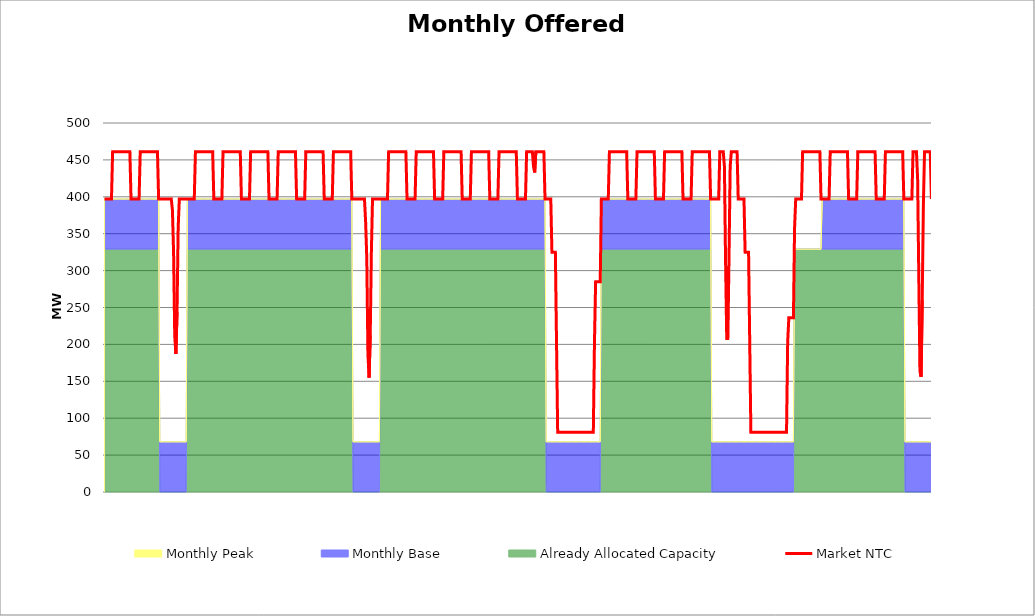
| Category | Market NTC |
|---|---|
| 0 | 397 |
| 1 | 397 |
| 2 | 397 |
| 3 | 397 |
| 4 | 397 |
| 5 | 397 |
| 6 | 397 |
| 7 | 461 |
| 8 | 461 |
| 9 | 461 |
| 10 | 461 |
| 11 | 461 |
| 12 | 461 |
| 13 | 461 |
| 14 | 461 |
| 15 | 461 |
| 16 | 461 |
| 17 | 461 |
| 18 | 461 |
| 19 | 461 |
| 20 | 461 |
| 21 | 461 |
| 22 | 461 |
| 23 | 397 |
| 24 | 397 |
| 25 | 397 |
| 26 | 397 |
| 27 | 397 |
| 28 | 397 |
| 29 | 397 |
| 30 | 397 |
| 31 | 461 |
| 32 | 461 |
| 33 | 461 |
| 34 | 461 |
| 35 | 461 |
| 36 | 461 |
| 37 | 461 |
| 38 | 461 |
| 39 | 461 |
| 40 | 461 |
| 41 | 461 |
| 42 | 461 |
| 43 | 461 |
| 44 | 461 |
| 45 | 461 |
| 46 | 461 |
| 47 | 397 |
| 48 | 397 |
| 49 | 397 |
| 50 | 397 |
| 51 | 397 |
| 52 | 397 |
| 53 | 397 |
| 54 | 397 |
| 55 | 397 |
| 56 | 397 |
| 57 | 397 |
| 58 | 397 |
| 59 | 382 |
| 60 | 325 |
| 61 | 212 |
| 62 | 187 |
| 63 | 244 |
| 64 | 358 |
| 65 | 397 |
| 66 | 397 |
| 67 | 397 |
| 68 | 397 |
| 69 | 397 |
| 70 | 397 |
| 71 | 397 |
| 72 | 397 |
| 73 | 397 |
| 74 | 397 |
| 75 | 397 |
| 76 | 397 |
| 77 | 397 |
| 78 | 397 |
| 79 | 461 |
| 80 | 461 |
| 81 | 461 |
| 82 | 461 |
| 83 | 461 |
| 84 | 461 |
| 85 | 461 |
| 86 | 461 |
| 87 | 461 |
| 88 | 461 |
| 89 | 461 |
| 90 | 461 |
| 91 | 461 |
| 92 | 461 |
| 93 | 461 |
| 94 | 461 |
| 95 | 397 |
| 96 | 397 |
| 97 | 397 |
| 98 | 397 |
| 99 | 397 |
| 100 | 397 |
| 101 | 397 |
| 102 | 397 |
| 103 | 461 |
| 104 | 461 |
| 105 | 461 |
| 106 | 461 |
| 107 | 461 |
| 108 | 461 |
| 109 | 461 |
| 110 | 461 |
| 111 | 461 |
| 112 | 461 |
| 113 | 461 |
| 114 | 461 |
| 115 | 461 |
| 116 | 461 |
| 117 | 461 |
| 118 | 461 |
| 119 | 397 |
| 120 | 397 |
| 121 | 397 |
| 122 | 397 |
| 123 | 397 |
| 124 | 397 |
| 125 | 397 |
| 126 | 397 |
| 127 | 461 |
| 128 | 461 |
| 129 | 461 |
| 130 | 461 |
| 131 | 461 |
| 132 | 461 |
| 133 | 461 |
| 134 | 461 |
| 135 | 461 |
| 136 | 461 |
| 137 | 461 |
| 138 | 461 |
| 139 | 461 |
| 140 | 461 |
| 141 | 461 |
| 142 | 461 |
| 143 | 397 |
| 144 | 397 |
| 145 | 397 |
| 146 | 397 |
| 147 | 397 |
| 148 | 397 |
| 149 | 397 |
| 150 | 397 |
| 151 | 461 |
| 152 | 461 |
| 153 | 461 |
| 154 | 461 |
| 155 | 461 |
| 156 | 461 |
| 157 | 461 |
| 158 | 461 |
| 159 | 461 |
| 160 | 461 |
| 161 | 461 |
| 162 | 461 |
| 163 | 461 |
| 164 | 461 |
| 165 | 461 |
| 166 | 461 |
| 167 | 397 |
| 168 | 397 |
| 169 | 397 |
| 170 | 397 |
| 171 | 397 |
| 172 | 397 |
| 173 | 397 |
| 174 | 397 |
| 175 | 461 |
| 176 | 461 |
| 177 | 461 |
| 178 | 461 |
| 179 | 461 |
| 180 | 461 |
| 181 | 461 |
| 182 | 461 |
| 183 | 461 |
| 184 | 461 |
| 185 | 461 |
| 186 | 461 |
| 187 | 461 |
| 188 | 461 |
| 189 | 461 |
| 190 | 461 |
| 191 | 397 |
| 192 | 397 |
| 193 | 397 |
| 194 | 397 |
| 195 | 397 |
| 196 | 397 |
| 197 | 397 |
| 198 | 397 |
| 199 | 461 |
| 200 | 461 |
| 201 | 461 |
| 202 | 461 |
| 203 | 461 |
| 204 | 461 |
| 205 | 461 |
| 206 | 461 |
| 207 | 461 |
| 208 | 461 |
| 209 | 461 |
| 210 | 461 |
| 211 | 461 |
| 212 | 461 |
| 213 | 461 |
| 214 | 461 |
| 215 | 397 |
| 216 | 397 |
| 217 | 397 |
| 218 | 397 |
| 219 | 397 |
| 220 | 397 |
| 221 | 397 |
| 222 | 397 |
| 223 | 397 |
| 224 | 397 |
| 225 | 397 |
| 226 | 397 |
| 227 | 366 |
| 228 | 317 |
| 229 | 187 |
| 230 | 155 |
| 231 | 212 |
| 232 | 325 |
| 233 | 397 |
| 234 | 397 |
| 235 | 397 |
| 236 | 397 |
| 237 | 397 |
| 238 | 397 |
| 239 | 397 |
| 240 | 397 |
| 241 | 397 |
| 242 | 397 |
| 243 | 397 |
| 244 | 397 |
| 245 | 397 |
| 246 | 397 |
| 247 | 461 |
| 248 | 461 |
| 249 | 461 |
| 250 | 461 |
| 251 | 461 |
| 252 | 461 |
| 253 | 461 |
| 254 | 461 |
| 255 | 461 |
| 256 | 461 |
| 257 | 461 |
| 258 | 461 |
| 259 | 461 |
| 260 | 461 |
| 261 | 461 |
| 262 | 461 |
| 263 | 397 |
| 264 | 397 |
| 265 | 397 |
| 266 | 397 |
| 267 | 397 |
| 268 | 397 |
| 269 | 397 |
| 270 | 397 |
| 271 | 461 |
| 272 | 461 |
| 273 | 461 |
| 274 | 461 |
| 275 | 461 |
| 276 | 461 |
| 277 | 461 |
| 278 | 461 |
| 279 | 461 |
| 280 | 461 |
| 281 | 461 |
| 282 | 461 |
| 283 | 461 |
| 284 | 461 |
| 285 | 461 |
| 286 | 461 |
| 287 | 397 |
| 288 | 397 |
| 289 | 397 |
| 290 | 397 |
| 291 | 397 |
| 292 | 397 |
| 293 | 397 |
| 294 | 397 |
| 295 | 461 |
| 296 | 461 |
| 297 | 461 |
| 298 | 461 |
| 299 | 461 |
| 300 | 461 |
| 301 | 461 |
| 302 | 461 |
| 303 | 461 |
| 304 | 461 |
| 305 | 461 |
| 306 | 461 |
| 307 | 461 |
| 308 | 461 |
| 309 | 461 |
| 310 | 461 |
| 311 | 397 |
| 312 | 397 |
| 313 | 397 |
| 314 | 397 |
| 315 | 397 |
| 316 | 397 |
| 317 | 397 |
| 318 | 397 |
| 319 | 461 |
| 320 | 461 |
| 321 | 461 |
| 322 | 461 |
| 323 | 461 |
| 324 | 461 |
| 325 | 461 |
| 326 | 461 |
| 327 | 461 |
| 328 | 461 |
| 329 | 461 |
| 330 | 461 |
| 331 | 461 |
| 332 | 461 |
| 333 | 461 |
| 334 | 461 |
| 335 | 397 |
| 336 | 397 |
| 337 | 397 |
| 338 | 397 |
| 339 | 397 |
| 340 | 397 |
| 341 | 397 |
| 342 | 397 |
| 343 | 461 |
| 344 | 461 |
| 345 | 461 |
| 346 | 461 |
| 347 | 461 |
| 348 | 461 |
| 349 | 461 |
| 350 | 461 |
| 351 | 461 |
| 352 | 461 |
| 353 | 461 |
| 354 | 461 |
| 355 | 461 |
| 356 | 461 |
| 357 | 461 |
| 358 | 461 |
| 359 | 397 |
| 360 | 397 |
| 361 | 397 |
| 362 | 397 |
| 363 | 397 |
| 364 | 397 |
| 365 | 397 |
| 366 | 397 |
| 367 | 461 |
| 368 | 461 |
| 369 | 461 |
| 370 | 461 |
| 371 | 461 |
| 372 | 461 |
| 373 | 441 |
| 374 | 433 |
| 375 | 461 |
| 376 | 461 |
| 377 | 461 |
| 378 | 461 |
| 379 | 461 |
| 380 | 461 |
| 381 | 461 |
| 382 | 461 |
| 383 | 397 |
| 384 | 397 |
| 385 | 397 |
| 386 | 397 |
| 387 | 397 |
| 388 | 397 |
| 389 | 325 |
| 390 | 325 |
| 391 | 325 |
| 392 | 325 |
| 393 | 203 |
| 394 | 81 |
| 395 | 81 |
| 396 | 81 |
| 397 | 81 |
| 398 | 81 |
| 399 | 81 |
| 400 | 81 |
| 401 | 81 |
| 402 | 81 |
| 403 | 81 |
| 404 | 81 |
| 405 | 81 |
| 406 | 81 |
| 407 | 81 |
| 408 | 81 |
| 409 | 81 |
| 410 | 81 |
| 411 | 81 |
| 412 | 81 |
| 413 | 81 |
| 414 | 81 |
| 415 | 81 |
| 416 | 81 |
| 417 | 81 |
| 418 | 81 |
| 419 | 81 |
| 420 | 81 |
| 421 | 81 |
| 422 | 81 |
| 423 | 81 |
| 424 | 81 |
| 425 | 81 |
| 426 | 203 |
| 427 | 285 |
| 428 | 285 |
| 429 | 285 |
| 430 | 285 |
| 431 | 285 |
| 432 | 397 |
| 433 | 397 |
| 434 | 397 |
| 435 | 397 |
| 436 | 397 |
| 437 | 397 |
| 438 | 397 |
| 439 | 461 |
| 440 | 461 |
| 441 | 461 |
| 442 | 461 |
| 443 | 461 |
| 444 | 461 |
| 445 | 461 |
| 446 | 461 |
| 447 | 461 |
| 448 | 461 |
| 449 | 461 |
| 450 | 461 |
| 451 | 461 |
| 452 | 461 |
| 453 | 461 |
| 454 | 461 |
| 455 | 397 |
| 456 | 397 |
| 457 | 397 |
| 458 | 397 |
| 459 | 397 |
| 460 | 397 |
| 461 | 397 |
| 462 | 397 |
| 463 | 461 |
| 464 | 461 |
| 465 | 461 |
| 466 | 461 |
| 467 | 461 |
| 468 | 461 |
| 469 | 461 |
| 470 | 461 |
| 471 | 461 |
| 472 | 461 |
| 473 | 461 |
| 474 | 461 |
| 475 | 461 |
| 476 | 461 |
| 477 | 461 |
| 478 | 461 |
| 479 | 397 |
| 480 | 397 |
| 481 | 397 |
| 482 | 397 |
| 483 | 397 |
| 484 | 397 |
| 485 | 397 |
| 486 | 397 |
| 487 | 461 |
| 488 | 461 |
| 489 | 461 |
| 490 | 461 |
| 491 | 461 |
| 492 | 461 |
| 493 | 461 |
| 494 | 461 |
| 495 | 461 |
| 496 | 461 |
| 497 | 461 |
| 498 | 461 |
| 499 | 461 |
| 500 | 461 |
| 501 | 461 |
| 502 | 461 |
| 503 | 397 |
| 504 | 397 |
| 505 | 397 |
| 506 | 397 |
| 507 | 397 |
| 508 | 397 |
| 509 | 397 |
| 510 | 397 |
| 511 | 461 |
| 512 | 461 |
| 513 | 461 |
| 514 | 461 |
| 515 | 461 |
| 516 | 461 |
| 517 | 461 |
| 518 | 461 |
| 519 | 461 |
| 520 | 461 |
| 521 | 461 |
| 522 | 461 |
| 523 | 461 |
| 524 | 461 |
| 525 | 461 |
| 526 | 461 |
| 527 | 397 |
| 528 | 397 |
| 529 | 397 |
| 530 | 397 |
| 531 | 397 |
| 532 | 397 |
| 533 | 397 |
| 534 | 397 |
| 535 | 461 |
| 536 | 461 |
| 537 | 461 |
| 538 | 461 |
| 539 | 441 |
| 540 | 312 |
| 541 | 208 |
| 542 | 208 |
| 543 | 320 |
| 544 | 441 |
| 545 | 461 |
| 546 | 461 |
| 547 | 461 |
| 548 | 461 |
| 549 | 461 |
| 550 | 461 |
| 551 | 397 |
| 552 | 397 |
| 553 | 397 |
| 554 | 397 |
| 555 | 397 |
| 556 | 397 |
| 557 | 325 |
| 558 | 325 |
| 559 | 325 |
| 560 | 325 |
| 561 | 203 |
| 562 | 81 |
| 563 | 81 |
| 564 | 81 |
| 565 | 81 |
| 566 | 81 |
| 567 | 81 |
| 568 | 81 |
| 569 | 81 |
| 570 | 81 |
| 571 | 81 |
| 572 | 81 |
| 573 | 81 |
| 574 | 81 |
| 575 | 81 |
| 576 | 81 |
| 577 | 81 |
| 578 | 81 |
| 579 | 81 |
| 580 | 81 |
| 581 | 81 |
| 582 | 81 |
| 583 | 81 |
| 584 | 81 |
| 585 | 81 |
| 586 | 81 |
| 587 | 81 |
| 588 | 81 |
| 589 | 81 |
| 590 | 81 |
| 591 | 81 |
| 592 | 81 |
| 593 | 81 |
| 594 | 203 |
| 595 | 236 |
| 596 | 236 |
| 597 | 236 |
| 598 | 236 |
| 599 | 236 |
| 600 | 358 |
| 601 | 397 |
| 602 | 397 |
| 603 | 397 |
| 604 | 397 |
| 605 | 397 |
| 606 | 397 |
| 607 | 461 |
| 608 | 461 |
| 609 | 461 |
| 610 | 461 |
| 611 | 461 |
| 612 | 461 |
| 613 | 461 |
| 614 | 461 |
| 615 | 461 |
| 616 | 461 |
| 617 | 461 |
| 618 | 461 |
| 619 | 461 |
| 620 | 461 |
| 621 | 461 |
| 622 | 461 |
| 623 | 397 |
| 624 | 397 |
| 625 | 397 |
| 626 | 397 |
| 627 | 397 |
| 628 | 397 |
| 629 | 397 |
| 630 | 397 |
| 631 | 461 |
| 632 | 461 |
| 633 | 461 |
| 634 | 461 |
| 635 | 461 |
| 636 | 461 |
| 637 | 461 |
| 638 | 461 |
| 639 | 461 |
| 640 | 461 |
| 641 | 461 |
| 642 | 461 |
| 643 | 461 |
| 644 | 461 |
| 645 | 461 |
| 646 | 461 |
| 647 | 397 |
| 648 | 397 |
| 649 | 397 |
| 650 | 397 |
| 651 | 397 |
| 652 | 397 |
| 653 | 397 |
| 654 | 397 |
| 655 | 461 |
| 656 | 461 |
| 657 | 461 |
| 658 | 461 |
| 659 | 461 |
| 660 | 461 |
| 661 | 461 |
| 662 | 461 |
| 663 | 461 |
| 664 | 461 |
| 665 | 461 |
| 666 | 461 |
| 667 | 461 |
| 668 | 461 |
| 669 | 461 |
| 670 | 461 |
| 671 | 397 |
| 672 | 397 |
| 673 | 397 |
| 674 | 397 |
| 675 | 397 |
| 676 | 397 |
| 677 | 397 |
| 678 | 397 |
| 679 | 461 |
| 680 | 461 |
| 681 | 461 |
| 682 | 461 |
| 683 | 461 |
| 684 | 461 |
| 685 | 461 |
| 686 | 461 |
| 687 | 461 |
| 688 | 461 |
| 689 | 461 |
| 690 | 461 |
| 691 | 461 |
| 692 | 461 |
| 693 | 461 |
| 694 | 461 |
| 695 | 397 |
| 696 | 397 |
| 697 | 397 |
| 698 | 397 |
| 699 | 397 |
| 700 | 397 |
| 701 | 397 |
| 702 | 397 |
| 703 | 461 |
| 704 | 461 |
| 705 | 461 |
| 706 | 461 |
| 707 | 424 |
| 708 | 294 |
| 709 | 164 |
| 710 | 156 |
| 711 | 260 |
| 712 | 389 |
| 713 | 461 |
| 714 | 461 |
| 715 | 461 |
| 716 | 461 |
| 717 | 461 |
| 718 | 461 |
| 719 | 397 |